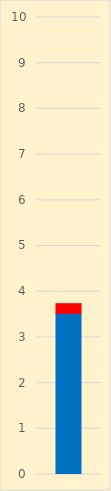
| Category | COP | IP |
|---|---|---|
| 0 | 3.526 | 0.213 |